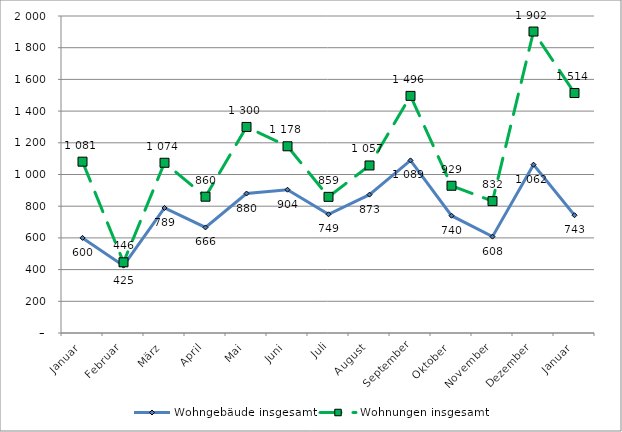
| Category | Wohngebäude insgesamt | Wohnungen insgesamt |
|---|---|---|
| Januar | 600 | 1081 |
| Februar | 425 | 446 |
| März | 789 | 1074 |
| April | 666 | 860 |
| Mai | 880 | 1300 |
| Juni | 904 | 1178 |
| Juli | 749 | 859 |
| August | 873 | 1057 |
| September | 1089 | 1496 |
| Oktober | 740 | 929 |
| November | 608 | 832 |
| Dezember | 1062 | 1902 |
| Januar | 743 | 1514 |